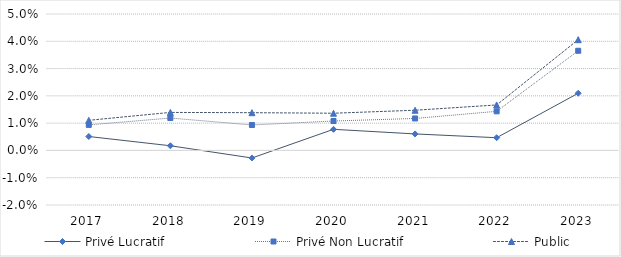
| Category | Privé Lucratif | Privé Non Lucratif | Public |
|---|---|---|---|
| 2017 | 0.005 | 0.009 | 0.011 |
| 2018 | 0.002 | 0.012 | 0.014 |
| 2019 | -0.003 | 0.009 | 0.014 |
| 2020 | 0.008 | 0.011 | 0.014 |
| 2021 | 0.006 | 0.012 | 0.015 |
| 2022 | 0.005 | 0.014 | 0.017 |
| 2023 | 0.021 | 0.037 | 0.041 |